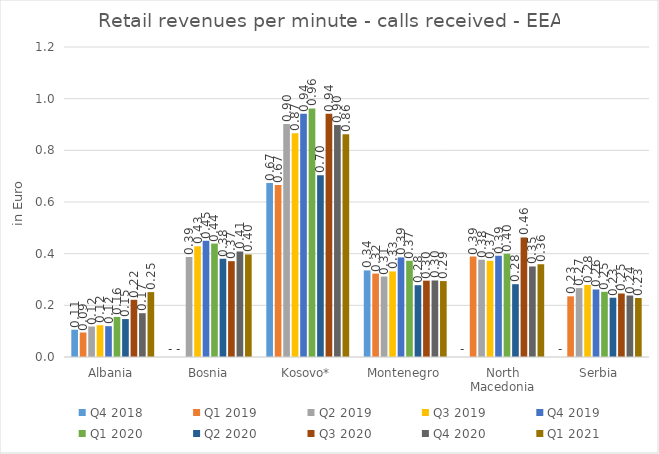
| Category | Q4 2018 | Q1 2019 | Q2 2019 | Q3 2019 | Q4 2019 | Q1 2020 | Q2 2020 | Q3 2020 | Q4 2020 | Q1 2021 |
|---|---|---|---|---|---|---|---|---|---|---|
| Albania | 0.106 | 0.095 | 0.118 | 0.123 | 0.119 | 0.155 | 0.147 | 0.221 | 0.17 | 0.251 |
| Bosnia | 0 | 0 | 0.387 | 0.428 | 0.45 | 0.439 | 0.38 | 0.371 | 0.408 | 0.397 |
| Kosovo* | 0.674 | 0.665 | 0.902 | 0.866 | 0.942 | 0.962 | 0.704 | 0.941 | 0.898 | 0.863 |
| Montenegro | 0.335 | 0.323 | 0.311 | 0.331 | 0.386 | 0.373 | 0.278 | 0.295 | 0.296 | 0.294 |
| North Macedonia | 0 | 0.389 | 0.377 | 0.372 | 0.392 | 0.399 | 0.282 | 0.463 | 0.35 | 0.359 |
| Serbia | 0 | 0.235 | 0.267 | 0.279 | 0.261 | 0.252 | 0.229 | 0.246 | 0.238 | 0.228 |